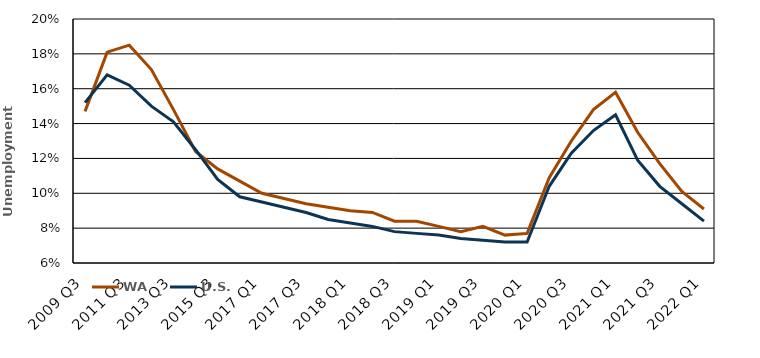
| Category | WA | U.S. |
|---|---|---|
| 2009 Q3 | 0.147 | 0.152 |
| 2010 Q3 | 0.181 | 0.168 |
| 2011 Q3 | 0.185 | 0.162 |
| 2012 Q3 | 0.171 | 0.15 |
| 2013 Q3 | 0.148 | 0.141 |
| 2014 Q3 | 0.124 | 0.125 |
| 2015 Q3 | 0.114 | 0.108 |
| 2016 Q3 | 0.107 | 0.098 |
| 2017 Q1 | 0.1 | 0.095 |
| 2017 Q2 | 0.097 | 0.092 |
| 2017 Q3 | 0.094 | 0.089 |
| 2017 Annual | 0.092 | 0.085 |
| 2018 Q1 | 0.09 | 0.083 |
| 2018 Q2 | 0.089 | 0.081 |
| 2018 Q3 | 0.084 | 0.078 |
| 2018 Annual | 0.084 | 0.077 |
| 2019 Q1 | 0.081 | 0.076 |
| 2019 Q2 | 0.078 | 0.074 |
| 2019 Q3 | 0.081 | 0.073 |
| 2019 Annual | 0.076 | 0.072 |
| 2020 Q1 | 0.077 | 0.072 |
| 2020 Q2 | 0.109 | 0.104 |
| 2020 Q3 | 0.13 | 0.123 |
| 2020 Annual | 0.148 | 0.136 |
| 2021 Q1 | 0.158 | 0.145 |
| 2021 Q2 | 0.135 | 0.119 |
| 2021 Q3 | 0.117 | 0.104 |
| 2021 Annual | 0.101 | 0.094 |
| 2022 Q1 | 0.091 | 0.084 |